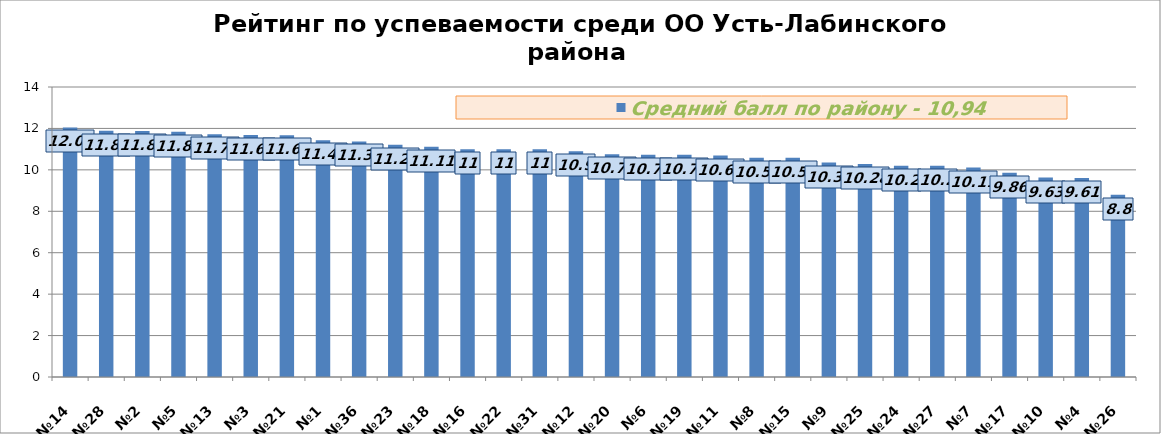
| Category | Средний балл по району - 10,94 |
|---|---|
| №14 | 12.05 |
| №28 | 11.89 |
| №2 | 11.87 |
| №5 | 11.84 |
| №13 | 11.72 |
| №3 | 11.68 |
| №21 | 11.67 |
| №1 | 11.43 |
| №36 | 11.37 |
| №23 | 11.21 |
| №18 | 11.11 |
| №16 | 11 |
| №22 | 11 |
| №31 | 11 |
| №12 | 10.9 |
| №20 | 10.75 |
| №6 | 10.73 |
| №19 | 10.73 |
| №11 | 10.69 |
| №8 | 10.59 |
| №15 | 10.58 |
| №9 | 10.35 |
| №25 | 10.28 |
| №24 | 10.2 |
| №27 | 10.2 |
| №7 | 10.11 |
| №17 | 9.86 |
| №10 | 9.63 |
| №4 | 9.61 |
| №26 | 8.8 |